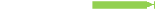
| Category | Used by more than 80% of Fortune 500 companies |
|---|---|
| Used by more than 80% of Fortune 500 companies | 2 |